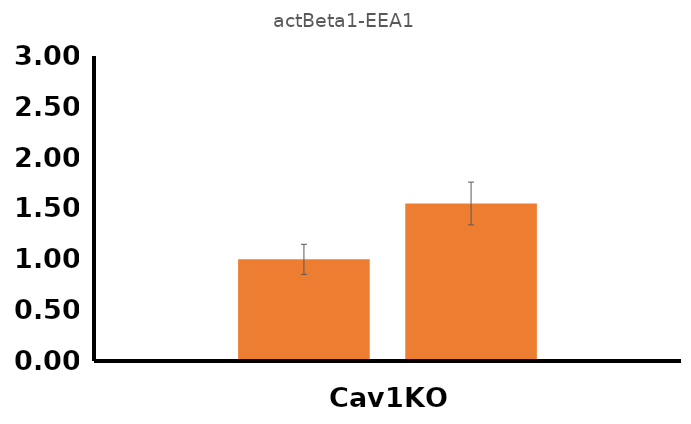
| Category | Control | shRNATLn2+siRNATln1 |
|---|---|---|
| Cav1KO  | 1 | 1.549 |